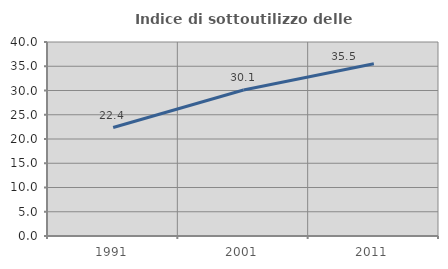
| Category | Indice di sottoutilizzo delle abitazioni  |
|---|---|
| 1991.0 | 22.362 |
| 2001.0 | 30.105 |
| 2011.0 | 35.502 |